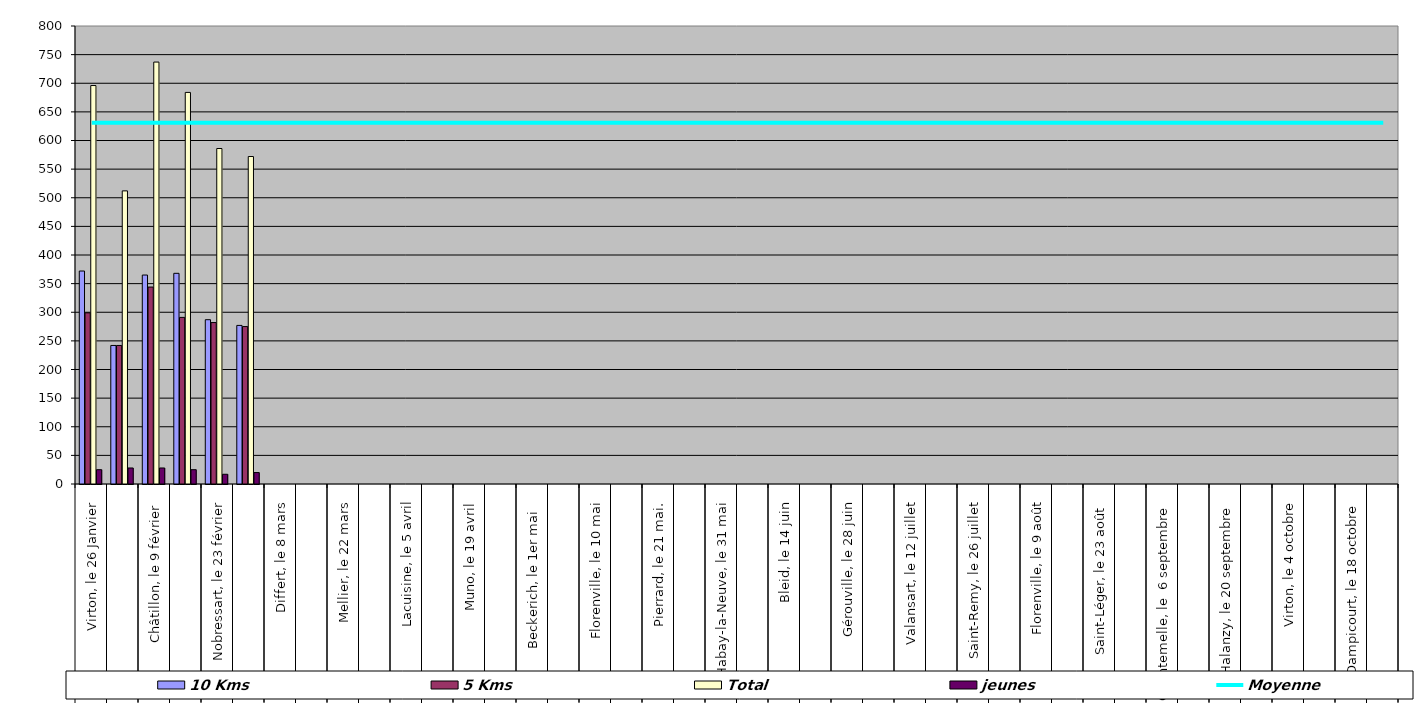
| Category | 10 Kms | 5 Kms | Total | jeunes |
|---|---|---|---|---|
| 0 | 372 | 299 | 696 | 25 |
| 1 | 242 | 242 | 512 | 28 |
| 2 | 365 | 344 | 737 | 28 |
| 3 | 368 | 291 | 684 | 25 |
| 4 | 287 | 282 | 586 | 17 |
| 5 | 277 | 275 | 572 | 20 |
| 6 | 0 | 0 | 0 | 0 |
| 7 | 0 | 0 | 0 | 0 |
| 8 | 0 | 0 | 0 | 0 |
| 9 | 0 | 0 | 0 | 0 |
| 10 | 0 | 0 | 0 | 0 |
| 11 | 0 | 0 | 0 | 0 |
| 12 | 0 | 0 | 0 | 0 |
| 13 | 0 | 0 | 0 | 0 |
| 14 | 0 | 0 | 0 | 0 |
| 15 | 0 | 0 | 0 | 0 |
| 16 | 0 | 0 | 0 | 0 |
| 17 | 0 | 0 | 0 | 0 |
| 18 | 0 | 0 | 0 | 0 |
| 19 | 0 | 0 | 0 | 0 |
| 20 | 0 | 0 | 0 | 0 |
| 21 | 0 | 0 | 0 | 0 |
| 22 | 0 | 0 | 0 | 0 |
| 23 | 0 | 0 | 0 | 0 |
| 24 | 0 | 0 | 0 | 0 |
| 25 | 0 | 0 | 0 | 0 |
| 26 | 0 | 0 | 0 | 0 |
| 27 | 0 | 0 | 0 | 0 |
| 28 | 0 | 0 | 0 | 0 |
| 29 | 0 | 0 | 0 | 0 |
| 30 | 0 | 0 | 0 | 0 |
| 31 | 0 | 0 | 0 | 0 |
| 32 | 0 | 0 | 0 | 0 |
| 33 | 0 | 0 | 0 | 0 |
| 34 | 0 | 0 | 0 | 0 |
| 35 | 0 | 0 | 0 | 0 |
| 36 | 0 | 0 | 0 | 0 |
| 37 | 0 | 0 | 0 | 0 |
| 38 | 0 | 0 | 0 | 0 |
| 39 | 0 | 0 | 0 | 0 |
| 40 | 0 | 0 | 0 | 0 |
| 41 | 0 | 0 | 0 | 0 |